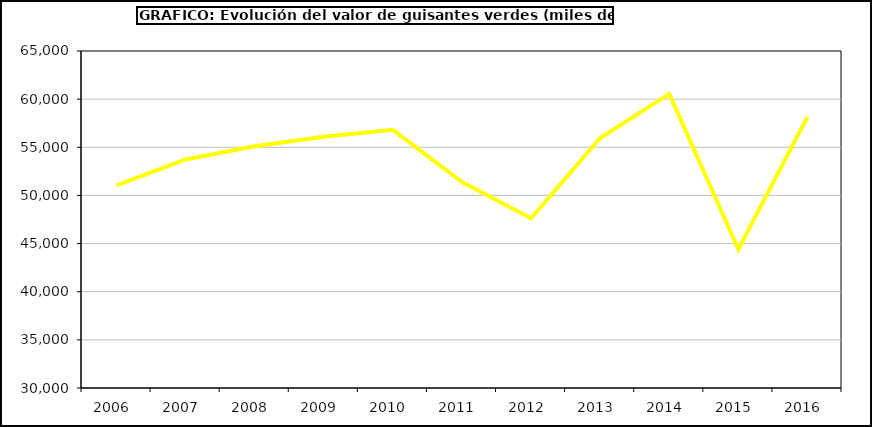
| Category | Valor |
|---|---|
| 2006.0 | 51039.987 |
| 2007.0 | 53737.412 |
| 2008.0 | 55115.003 |
| 2009.0 | 56100.148 |
| 2010.0 | 56808.753 |
| 2011.0 | 51384.72 |
| 2012.0 | 47635.04 |
| 2013.0 | 55957.374 |
| 2014.0 | 60552.887 |
| 2015.0 | 44411 |
| 2016.0 | 58153 |